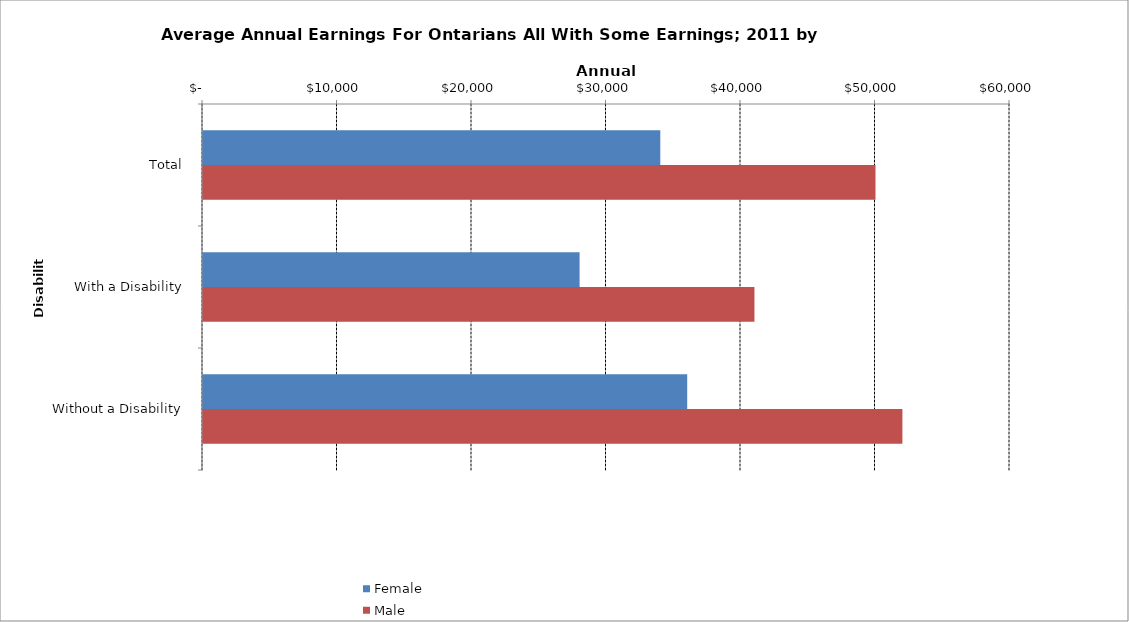
| Category | Female | Male |
|---|---|---|
| Total | 34000 | 50000 |
|  With a Disability  | 28000 | 41000 |
|  Without a Disability  | 36000 | 52000 |